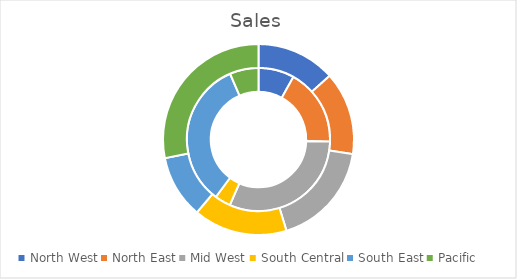
| Category | January | February |
|---|---|---|
| North West | 25690 | 38500 |
| North East | 55120 | 40500 |
| Mid West | 98650 | 51250 |
| South Central | 11455 | 45750 |
| South East | 105750 | 30800 |
| Pacific | 20590 | 80950 |